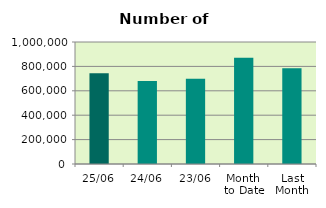
| Category | Series 0 |
|---|---|
| 25/06 | 743460 |
| 24/06 | 680004 |
| 23/06 | 698684 |
| Month 
to Date | 870371.789 |
| Last
Month | 785067 |